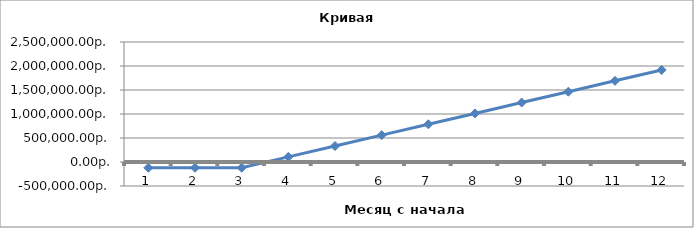
| Category | Series 0 |
|---|---|
| 0 | -120000 |
| 1 | -120000 |
| 2 | -120000 |
| 3 | 106401.951 |
| 4 | 332803.901 |
| 5 | 559205.852 |
| 6 | 785607.802 |
| 7 | 1012009.753 |
| 8 | 1238411.703 |
| 9 | 1464813.654 |
| 10 | 1691215.604 |
| 11 | 1917617.555 |